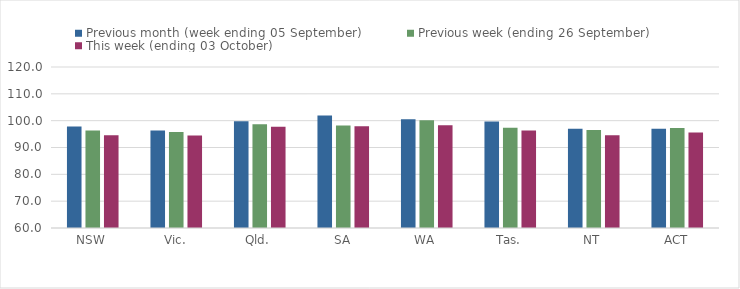
| Category | Previous month (week ending 05 September) | Previous week (ending 26 September) | This week (ending 03 October) |
|---|---|---|---|
| NSW | 97.79 | 96.36 | 94.53 |
| Vic. | 96.33 | 95.79 | 94.51 |
| Qld. | 99.76 | 98.68 | 97.77 |
| SA | 101.89 | 98.2 | 97.89 |
| WA | 100.51 | 100.16 | 98.33 |
| Tas. | 99.68 | 97.32 | 96.3 |
| NT | 97.03 | 96.55 | 94.54 |
| ACT | 96.95 | 97.3 | 95.55 |